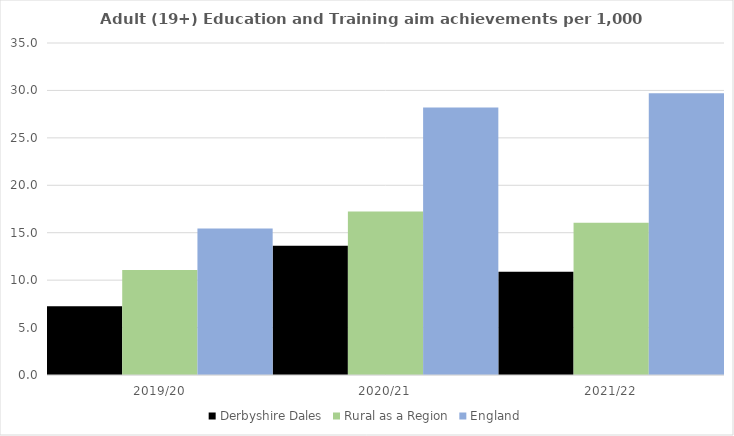
| Category | Derbyshire Dales | Rural as a Region | England |
|---|---|---|---|
| 2019/20 | 7.258 | 11.081 | 15.446 |
| 2020/21 | 13.619 | 17.224 | 28.211 |
| 2021/22 | 10.878 | 16.063 | 29.711 |